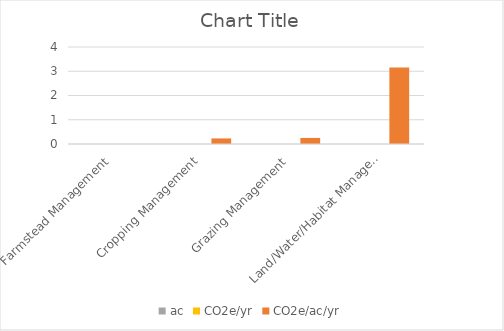
| Category | ac | CO2e/yr | CO2e/ac/yr |
|---|---|---|---|
| Farmstead Management | 0 | 0 | 0 |
| Cropping Management | 0 | 0 | 0.23 |
| Grazing Management | 0 | 0 | 0.25 |
| Land/Water/Habitat Management | 0 | 0 | 3.152 |